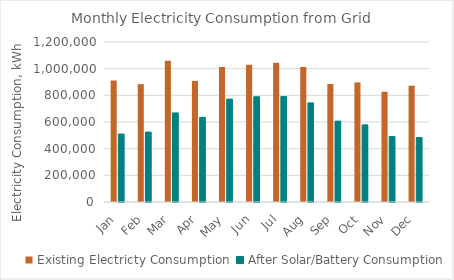
| Category | Existing Electricty Consumption | After Solar/Battery Consumption |
|---|---|---|
| Jan | 911440.8 | 509628.497 |
| Feb | 883713.055 | 524383.079 |
| Mar | 1059268.887 | 668104.918 |
| Apr | 908225.419 | 635219.881 |
| May | 1013012.328 | 771526.697 |
| Jun | 1028785.204 | 789434.093 |
| Jul | 1045244.164 | 790792.073 |
| Aug | 1013209.97 | 743262.454 |
| Sep | 884668.599 | 606778.291 |
| Oct | 897150.182 | 578290.938 |
| Nov | 826843.596 | 490808.225 |
| Dec | 872613.923 | 484130.478 |